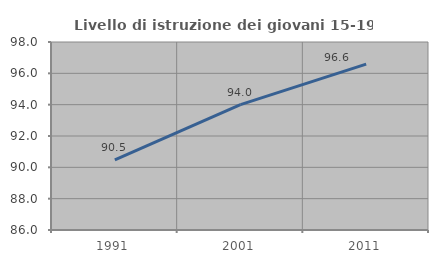
| Category | Livello di istruzione dei giovani 15-19 anni |
|---|---|
| 1991.0 | 90.476 |
| 2001.0 | 94 |
| 2011.0 | 96.591 |